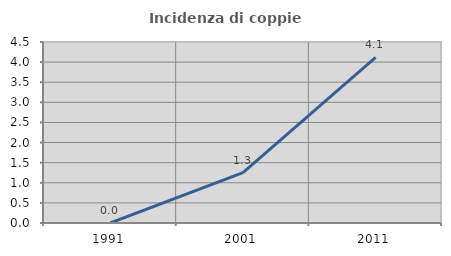
| Category | Incidenza di coppie miste |
|---|---|
| 1991.0 | 0 |
| 2001.0 | 1.254 |
| 2011.0 | 4.115 |